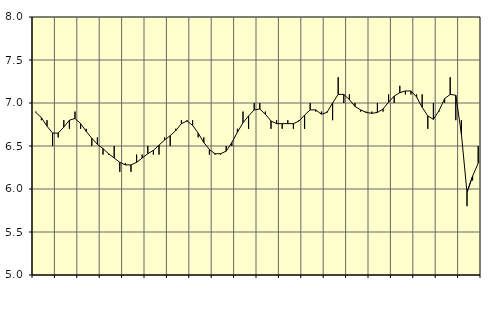
| Category | Piggar | Transport, SNI 49-53 |
|---|---|---|
| nan | 6.9 | 6.89 |
| 1.0 | 6.8 | 6.83 |
| 1.0 | 6.8 | 6.73 |
| 1.0 | 6.5 | 6.65 |
| nan | 6.6 | 6.65 |
| 2.0 | 6.8 | 6.72 |
| 2.0 | 6.7 | 6.8 |
| 2.0 | 6.9 | 6.82 |
| nan | 6.7 | 6.76 |
| 3.0 | 6.7 | 6.67 |
| 3.0 | 6.5 | 6.59 |
| 3.0 | 6.6 | 6.52 |
| nan | 6.4 | 6.47 |
| 4.0 | 6.4 | 6.41 |
| 4.0 | 6.5 | 6.36 |
| 4.0 | 6.2 | 6.31 |
| nan | 6.3 | 6.28 |
| 5.0 | 6.2 | 6.28 |
| 5.0 | 6.4 | 6.31 |
| 5.0 | 6.4 | 6.36 |
| nan | 6.5 | 6.41 |
| 6.0 | 6.4 | 6.45 |
| 6.0 | 6.4 | 6.51 |
| 6.0 | 6.6 | 6.57 |
| nan | 6.5 | 6.62 |
| 7.0 | 6.7 | 6.68 |
| 7.0 | 6.8 | 6.76 |
| 7.0 | 6.8 | 6.79 |
| nan | 6.8 | 6.74 |
| 8.0 | 6.6 | 6.65 |
| 8.0 | 6.6 | 6.54 |
| 8.0 | 6.4 | 6.46 |
| nan | 6.4 | 6.41 |
| 9.0 | 6.4 | 6.41 |
| 9.0 | 6.5 | 6.44 |
| 9.0 | 6.5 | 6.54 |
| nan | 6.7 | 6.66 |
| 10.0 | 6.9 | 6.77 |
| 10.0 | 6.7 | 6.85 |
| 10.0 | 7 | 6.92 |
| nan | 7 | 6.93 |
| 11.0 | 6.9 | 6.87 |
| 11.0 | 6.7 | 6.79 |
| 11.0 | 6.8 | 6.76 |
| nan | 6.7 | 6.76 |
| 12.0 | 6.8 | 6.76 |
| 12.0 | 6.7 | 6.76 |
| 12.0 | 6.8 | 6.79 |
| nan | 6.7 | 6.86 |
| 13.0 | 7 | 6.92 |
| 13.0 | 6.9 | 6.92 |
| 13.0 | 6.9 | 6.87 |
| nan | 6.9 | 6.89 |
| 14.0 | 6.8 | 7 |
| 14.0 | 7.3 | 7.1 |
| 14.0 | 7 | 7.1 |
| nan | 7.1 | 7.04 |
| 15.0 | 7 | 6.96 |
| 15.0 | 6.9 | 6.92 |
| 15.0 | 6.9 | 6.89 |
| nan | 6.9 | 6.88 |
| 16.0 | 7 | 6.89 |
| 16.0 | 6.9 | 6.93 |
| 16.0 | 7.1 | 7.01 |
| nan | 7 | 7.08 |
| 17.0 | 7.2 | 7.12 |
| 17.0 | 7.1 | 7.14 |
| 17.0 | 7.1 | 7.14 |
| nan | 7.1 | 7.07 |
| 18.0 | 7.1 | 6.95 |
| 18.0 | 6.7 | 6.85 |
| 18.0 | 7 | 6.81 |
| nan | 6.9 | 6.91 |
| 19.0 | 7 | 7.05 |
| 19.0 | 7.3 | 7.1 |
| 19.0 | 6.8 | 7.09 |
| nan | 6.8 | 6.64 |
| 20.0 | 5.8 | 5.96 |
| 20.0 | 6.1 | 6.15 |
| 20.0 | 6.5 | 6.3 |